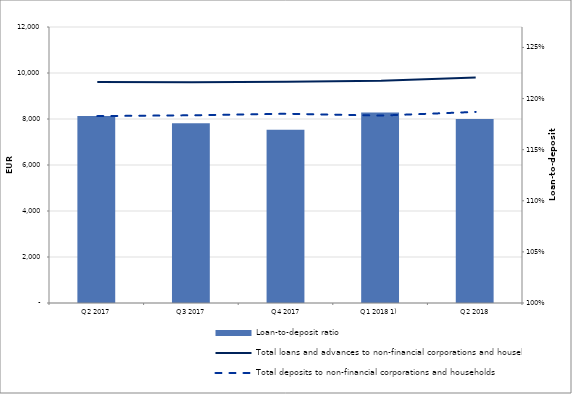
| Category | Loan-to-deposit ratio |
|---|---|
| Q2 2017 | 1.183 |
| Q3 2017 | 1.176 |
| Q4 2017 | 1.169 |
| Q1 2018 1) | 1.186 |
| Q2 2018 | 1.18 |